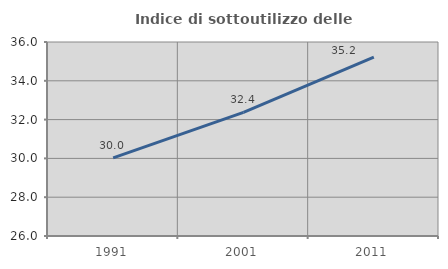
| Category | Indice di sottoutilizzo delle abitazioni  |
|---|---|
| 1991.0 | 30.025 |
| 2001.0 | 32.373 |
| 2011.0 | 35.222 |